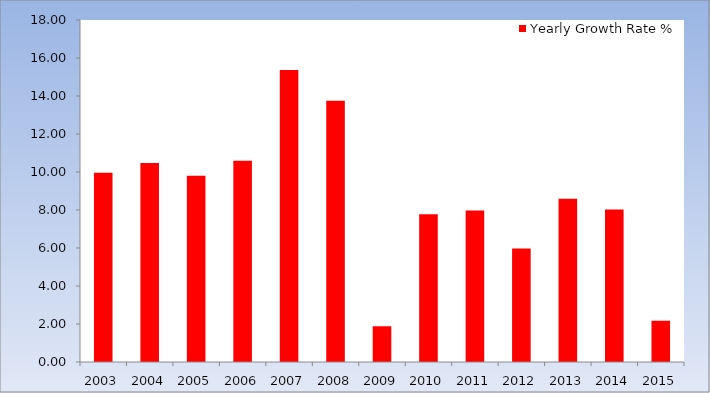
| Category | Yearly Growth Rate % |
|---|---|
| 2003.0 | 9.955 |
| 2004.0 | 10.478 |
| 2005.0 | 9.799 |
| 2006.0 | 10.588 |
| 2007.0 | 15.374 |
| 2008.0 | 13.752 |
| 2009.0 | 1.882 |
| 2010.0 | 7.778 |
| 2011.0 | 7.97 |
| 2012.0 | 5.97 |
| 2013.0 | 8.598 |
| 2014.0 | 8.032 |
| 2015.0 | 2.173 |